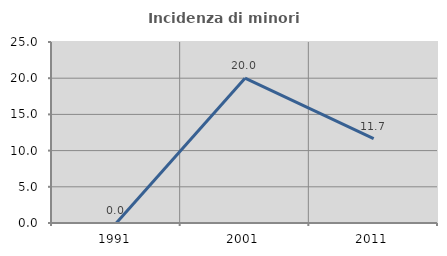
| Category | Incidenza di minori stranieri |
|---|---|
| 1991.0 | 0 |
| 2001.0 | 20 |
| 2011.0 | 11.667 |